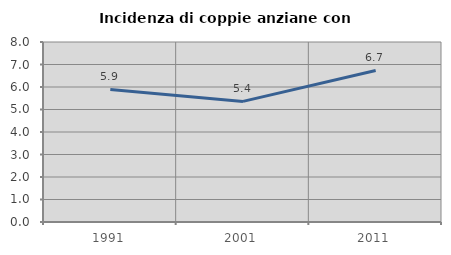
| Category | Incidenza di coppie anziane con figli |
|---|---|
| 1991.0 | 5.894 |
| 2001.0 | 5.36 |
| 2011.0 | 6.736 |